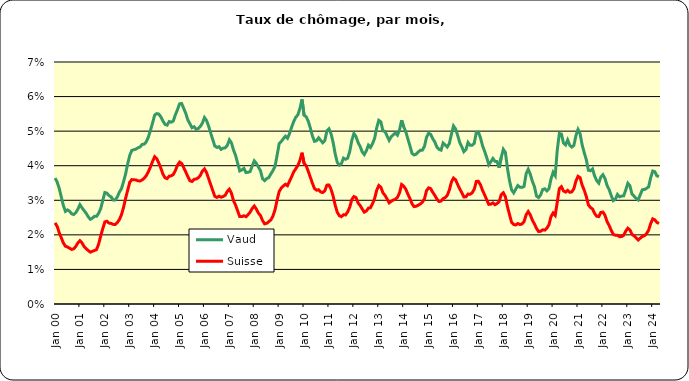
| Category | Vaud | Suisse |
|---|---|---|
| 2000-01-01 | 0.036 | 0.023 |
| 2000-02-01 | 0.035 | 0.022 |
| 2000-03-01 | 0.034 | 0.021 |
| 2000-04-01 | 0.031 | 0.019 |
| 2000-05-01 | 0.029 | 0.018 |
| 2000-06-01 | 0.027 | 0.017 |
| 2000-07-01 | 0.027 | 0.017 |
| 2000-08-01 | 0.027 | 0.016 |
| 2000-09-01 | 0.026 | 0.016 |
| 2000-10-01 | 0.026 | 0.016 |
| 2000-11-01 | 0.026 | 0.017 |
| 2000-12-01 | 0.027 | 0.018 |
| 2001-01-01 | 0.029 | 0.018 |
| 2001-02-01 | 0.028 | 0.018 |
| 2001-03-01 | 0.027 | 0.017 |
| 2001-04-01 | 0.026 | 0.016 |
| 2001-05-01 | 0.025 | 0.015 |
| 2001-06-01 | 0.025 | 0.015 |
| 2001-07-01 | 0.025 | 0.015 |
| 2001-08-01 | 0.025 | 0.015 |
| 2001-09-01 | 0.025 | 0.016 |
| 2001-10-01 | 0.026 | 0.017 |
| 2001-11-01 | 0.028 | 0.02 |
| 2001-12-01 | 0.03 | 0.022 |
| 2002-01-01 | 0.032 | 0.024 |
| 2002-02-01 | 0.032 | 0.024 |
| 2002-03-01 | 0.031 | 0.023 |
| 2002-04-01 | 0.031 | 0.023 |
| 2002-05-01 | 0.03 | 0.023 |
| 2002-06-01 | 0.03 | 0.023 |
| 2002-07-01 | 0.031 | 0.024 |
| 2002-08-01 | 0.032 | 0.024 |
| 2002-09-01 | 0.033 | 0.026 |
| 2002-10-01 | 0.035 | 0.028 |
| 2002-11-01 | 0.038 | 0.031 |
| 2002-12-01 | 0.041 | 0.033 |
| 2003-01-01 | 0.043 | 0.035 |
| 2003-02-01 | 0.044 | 0.036 |
| 2003-03-01 | 0.045 | 0.036 |
| 2003-04-01 | 0.045 | 0.036 |
| 2003-05-01 | 0.045 | 0.036 |
| 2003-06-01 | 0.045 | 0.036 |
| 2003-07-01 | 0.046 | 0.036 |
| 2003-08-01 | 0.046 | 0.036 |
| 2003-09-01 | 0.047 | 0.037 |
| 2003-10-01 | 0.048 | 0.038 |
| 2003-11-01 | 0.05 | 0.04 |
| 2003-12-01 | 0.052 | 0.041 |
| 2004-01-01 | 0.055 | 0.043 |
| 2004-02-01 | 0.055 | 0.042 |
| 2004-03-01 | 0.055 | 0.041 |
| 2004-04-01 | 0.054 | 0.039 |
| 2004-05-01 | 0.053 | 0.038 |
| 2004-06-01 | 0.052 | 0.037 |
| 2004-07-01 | 0.052 | 0.036 |
| 2004-08-01 | 0.053 | 0.037 |
| 2004-09-01 | 0.053 | 0.037 |
| 2004-10-01 | 0.053 | 0.037 |
| 2004-11-01 | 0.055 | 0.039 |
| 2004-12-01 | 0.056 | 0.04 |
| 2005-01-01 | 0.058 | 0.041 |
| 2005-02-01 | 0.058 | 0.041 |
| 2005-03-01 | 0.057 | 0.039 |
| 2005-04-01 | 0.055 | 0.038 |
| 2005-05-01 | 0.053 | 0.037 |
| 2005-06-01 | 0.052 | 0.036 |
| 2005-07-01 | 0.051 | 0.035 |
| 2005-08-01 | 0.051 | 0.036 |
| 2005-09-01 | 0.051 | 0.036 |
| 2005-10-01 | 0.051 | 0.037 |
| 2005-11-01 | 0.051 | 0.037 |
| 2005-12-01 | 0.052 | 0.038 |
| 2006-01-01 | 0.054 | 0.039 |
| 2006-02-01 | 0.053 | 0.038 |
| 2006-03-01 | 0.051 | 0.036 |
| 2006-04-01 | 0.049 | 0.035 |
| 2006-05-01 | 0.048 | 0.033 |
| 2006-06-01 | 0.046 | 0.031 |
| 2006-07-01 | 0.045 | 0.031 |
| 2006-08-01 | 0.046 | 0.031 |
| 2006-09-01 | 0.045 | 0.031 |
| 2006-10-01 | 0.045 | 0.031 |
| 2006-11-01 | 0.045 | 0.031 |
| 2006-12-01 | 0.046 | 0.033 |
| 2007-01-01 | 0.047 | 0.033 |
| 2007-02-01 | 0.047 | 0.032 |
| 2007-03-01 | 0.045 | 0.03 |
| 2007-04-01 | 0.043 | 0.029 |
| 2007-05-01 | 0.041 | 0.027 |
| 2007-06-01 | 0.038 | 0.025 |
| 2007-07-01 | 0.039 | 0.025 |
| 2007-08-01 | 0.039 | 0.026 |
| 2007-09-01 | 0.038 | 0.025 |
| 2007-10-01 | 0.038 | 0.026 |
| 2007-11-01 | 0.038 | 0.027 |
| 2007-12-01 | 0.04 | 0.028 |
| 2008-01-01 | 0.041 | 0.028 |
| 2008-02-01 | 0.041 | 0.027 |
| 2008-03-01 | 0.04 | 0.026 |
| 2008-04-01 | 0.039 | 0.026 |
| 2008-05-01 | 0.036 | 0.024 |
| 2008-06-01 | 0.036 | 0.023 |
| 2008-07-01 | 0.036 | 0.023 |
| 2008-08-01 | 0.037 | 0.024 |
| 2008-09-01 | 0.038 | 0.024 |
| 2008-10-01 | 0.039 | 0.025 |
| 2008-11-01 | 0.04 | 0.027 |
| 2008-12-01 | 0.043 | 0.03 |
| 2009-01-01 | 0.046 | 0.033 |
| 2009-02-01 | 0.047 | 0.034 |
| 2009-03-01 | 0.048 | 0.034 |
| 2009-04-01 | 0.049 | 0.035 |
| 2009-05-01 | 0.048 | 0.034 |
| 2009-06-01 | 0.049 | 0.036 |
| 2009-07-01 | 0.051 | 0.037 |
| 2009-08-01 | 0.053 | 0.038 |
| 2009-09-01 | 0.054 | 0.039 |
| 2009-10-01 | 0.055 | 0.04 |
| 2009-11-01 | 0.057 | 0.042 |
| 2009-12-01 | 0.059 | 0.044 |
| 2010-01-01 | 0.055 | 0.041 |
| 2010-02-01 | 0.054 | 0.04 |
| 2010-03-01 | 0.053 | 0.038 |
| 2010-04-01 | 0.051 | 0.037 |
| 2010-05-01 | 0.049 | 0.035 |
| 2010-06-01 | 0.047 | 0.033 |
| 2010-07-01 | 0.047 | 0.033 |
| 2010-08-01 | 0.048 | 0.033 |
| 2010-09-01 | 0.047 | 0.032 |
| 2010-10-01 | 0.047 | 0.032 |
| 2010-11-01 | 0.047 | 0.033 |
| 2010-12-01 | 0.05 | 0.034 |
| 2011-01-01 | 0.051 | 0.034 |
| 2011-02-01 | 0.049 | 0.033 |
| 2011-03-01 | 0.047 | 0.031 |
| 2011-04-01 | 0.043 | 0.029 |
| 2011-05-01 | 0.041 | 0.027 |
| 2011-06-01 | 0.04 | 0.026 |
| 2011-07-01 | 0.041 | 0.025 |
| 2011-08-01 | 0.042 | 0.026 |
| 2011-09-01 | 0.042 | 0.026 |
| 2011-10-01 | 0.042 | 0.027 |
| 2011-11-01 | 0.044 | 0.028 |
| 2011-12-01 | 0.047 | 0.03 |
| 2012-01-01 | 0.049 | 0.031 |
| 2012-02-01 | 0.048 | 0.031 |
| 2012-03-01 | 0.047 | 0.029 |
| 2012-04-01 | 0.046 | 0.028 |
| 2012-05-01 | 0.044 | 0.027 |
| 2012-06-01 | 0.043 | 0.027 |
| 2012-07-01 | 0.044 | 0.027 |
| 2012-08-01 | 0.046 | 0.028 |
| 2012-09-01 | 0.045 | 0.028 |
| 2012-10-01 | 0.046 | 0.029 |
| 2012-11-01 | 0.048 | 0.031 |
| 2012-12-01 | 0.051 | 0.033 |
| 2013-01-01 | 0.053 | 0.034 |
| 2013-02-01 | 0.053 | 0.034 |
| 2013-03-01 | 0.05 | 0.032 |
| 2013-04-01 | 0.05 | 0.031 |
| 2013-05-01 | 0.049 | 0.03 |
| 2013-06-01 | 0.047 | 0.029 |
| 2013-07-01 | 0.048 | 0.03 |
| 2013-08-01 | 0.049 | 0.03 |
| 2013-09-01 | 0.049 | 0.03 |
| 2013-10-01 | 0.049 | 0.031 |
| 2013-11-01 | 0.05 | 0.032 |
| 2013-12-01 | 0.053 | 0.035 |
| 2014-01-01 | 0.051 | 0.034 |
| 2014-02-01 | 0.05 | 0.033 |
| 2014-03-01 | 0.048 | 0.032 |
| 2014-04-01 | 0.046 | 0.031 |
| 2014-05-01 | 0.044 | 0.029 |
| 2014-06-01 | 0.043 | 0.028 |
| 2014-07-01 | 0.043 | 0.028 |
| 2014-08-01 | 0.044 | 0.029 |
| 2014-09-01 | 0.044 | 0.029 |
| 2014-10-01 | 0.045 | 0.029 |
| 2014-11-01 | 0.046 | 0.03 |
| 2014-12-01 | 0.048 | 0.033 |
| 2015-01-01 | 0.049 | 0.034 |
| 2015-02-01 | 0.049 | 0.033 |
| 2015-03-01 | 0.048 | 0.032 |
| 2015-04-01 | 0.047 | 0.031 |
| 2015-05-01 | 0.045 | 0.03 |
| 2015-06-01 | 0.045 | 0.03 |
| 2015-07-01 | 0.045 | 0.03 |
| 2015-08-01 | 0.047 | 0.03 |
| 2015-09-01 | 0.046 | 0.031 |
| 2015-10-01 | 0.045 | 0.031 |
| 2015-11-01 | 0.046 | 0.033 |
| 2015-12-01 | 0.049 | 0.035 |
| 2016-01-01 | 0.051 | 0.036 |
| 2016-02-01 | 0.051 | 0.036 |
| 2016-03-01 | 0.049 | 0.035 |
| 2016-04-01 | 0.047 | 0.033 |
| 2016-05-01 | 0.045 | 0.032 |
| 2016-06-01 | 0.044 | 0.031 |
| 2016-07-01 | 0.045 | 0.031 |
| 2016-08-01 | 0.047 | 0.032 |
| 2016-09-01 | 0.046 | 0.032 |
| 2016-10-01 | 0.046 | 0.032 |
| 2016-11-01 | 0.047 | 0.033 |
| 2016-12-01 | 0.05 | 0.035 |
| 2017-01-01 | 0.05 | 0.035 |
| 2017-02-01 | 0.048 | 0.034 |
| 2017-03-01 | 0.046 | 0.033 |
| 2017-04-01 | 0.044 | 0.032 |
| 2017-05-01 | 0.042 | 0.03 |
| 2017-06-01 | 0.04 | 0.029 |
| 2017-07-01 | 0.041 | 0.029 |
| 2017-08-01 | 0.042 | 0.029 |
| 2017-09-01 | 0.041 | 0.029 |
| 2017-10-01 | 0.041 | 0.029 |
| 2017-11-01 | 0.039 | 0.03 |
| 2017-12-01 | 0.042 | 0.032 |
| 2018-01-01 | 0.045 | 0.032 |
| 2018-02-01 | 0.044 | 0.031 |
| 2018-03-01 | 0.039 | 0.028 |
| 2018-04-01 | 0.036 | 0.026 |
| 2018-05-01 | 0.033 | 0.024 |
| 2018-06-01 | 0.032 | 0.023 |
| 2018-07-01 | 0.033 | 0.023 |
| 2018-08-01 | 0.034 | 0.023 |
| 2018-09-01 | 0.034 | 0.023 |
| 2018-10-01 | 0.034 | 0.023 |
| 2018-11-01 | 0.034 | 0.024 |
| 2018-12-01 | 0.038 | 0.026 |
| 2019-01-01 | 0.039 | 0.027 |
| 2019-02-01 | 0.038 | 0.026 |
| 2019-03-01 | 0.035 | 0.024 |
| 2019-04-01 | 0.034 | 0.023 |
| 2019-05-01 | 0.031 | 0.022 |
| 2019-06-01 | 0.031 | 0.021 |
| 2019-07-01 | 0.032 | 0.021 |
| 2019-08-01 | 0.033 | 0.021 |
| 2019-09-01 | 0.033 | 0.021 |
| 2019-10-01 | 0.033 | 0.022 |
| 2019-11-01 | 0.033 | 0.023 |
| 2019-12-01 | 0.036 | 0.025 |
| 2020-01-01 | 0.038 | 0.026 |
| 2020-02-01 | 0.037 | 0.026 |
| 2020-03-01 | 0.045 | 0.03 |
| 2020-04-01 | 0.049 | 0.033 |
| 2020-05-01 | 0.049 | 0.034 |
| 2020-06-01 | 0.047 | 0.033 |
| 2020-07-01 | 0.046 | 0.032 |
| 2020-08-01 | 0.047 | 0.033 |
| 2020-09-01 | 0.046 | 0.032 |
| 2020-10-01 | 0.045 | 0.032 |
| 2020-11-01 | 0.046 | 0.033 |
| 2020-12-01 | 0.049 | 0.036 |
| 2021-01-01 | 0.05 | 0.037 |
| 2021-02-01 | 0.049 | 0.037 |
| 2021-03-01 | 0.046 | 0.034 |
| 2021-04-01 | 0.044 | 0.033 |
| 2021-05-01 | 0.042 | 0.031 |
| 2021-06-01 | 0.039 | 0.029 |
| 2021-07-01 | 0.039 | 0.028 |
| 2021-08-01 | 0.039 | 0.027 |
| 2021-09-01 | 0.037 | 0.026 |
| 2021-10-01 | 0.036 | 0.025 |
| 2021-11-01 | 0.035 | 0.025 |
| 2021-12-01 | 0.037 | 0.026 |
| 2022-01-01 | 0.037 | 0.027 |
| 2022-02-01 | 0.036 | 0.026 |
| 2022-03-01 | 0.034 | 0.024 |
| 2022-04-01 | 0.033 | 0.023 |
| 2022-05-01 | 0.031 | 0.021 |
| 2022-06-01 | 0.03 | 0.02 |
| 2022-07-01 | 0.03 | 0.02 |
| 2022-08-01 | 0.032 | 0.02 |
| 2022-09-01 | 0.031 | 0.019 |
| 2022-10-01 | 0.031 | 0.019 |
| 2022-11-01 | 0.031 | 0.02 |
| 2022-12-01 | 0.033 | 0.021 |
| 2023-01-01 | 0.035 | 0.022 |
| 2023-02-01 | 0.034 | 0.021 |
| 2023-03-01 | 0.032 | 0.02 |
| 2023-04-01 | 0.031 | 0.02 |
| 2023-05-01 | 0.031 | 0.019 |
| 2023-06-01 | 0.03 | 0.019 |
| 2023-07-01 | 0.032 | 0.019 |
| 2023-08-01 | 0.033 | 0.02 |
| 2023-09-01 | 0.033 | 0.02 |
| 2023-10-01 | 0.033 | 0.02 |
| 2023-11-01 | 0.034 | 0.021 |
| 2023-12-01 | 0.036 | 0.023 |
| 2024-01-01 | 0.038 | 0.025 |
| 2024-02-01 | 0.038 | 0.024 |
| 2024-03-01 | 0.037 | 0.024 |
| 2024-04-01 | 0.037 | 0.023 |